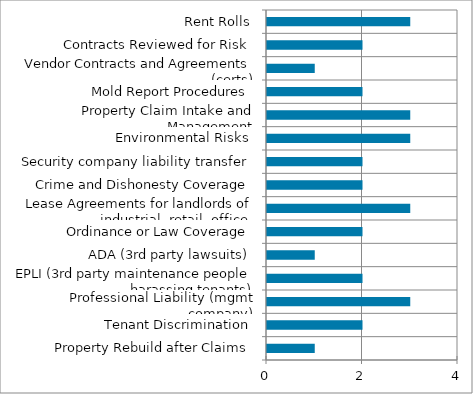
| Category | Series 0 |
|---|---|
| Property Rebuild after Claims | 1 |
| Tenant Discrimination | 2 |
| Professional Liability (mgmt company) | 3 |
| EPLI (3rd party maintenance people harassing tenants) | 2 |
| ADA (3rd party lawsuits) | 1 |
| Ordinance or Law Coverage | 2 |
| Lease Agreements for landlords of industrial, retail, office. | 3 |
| Crime and Dishonesty Coverage | 2 |
| Security company liability transfer | 2 |
|  Environmental Risks | 3 |
| Property Claim Intake and Management | 3 |
| Mold Report Procedures | 2 |
| Vendor Contracts and Agreements (certs) | 1 |
| Contracts Reviewed for Risk | 2 |
| Rent Rolls | 3 |